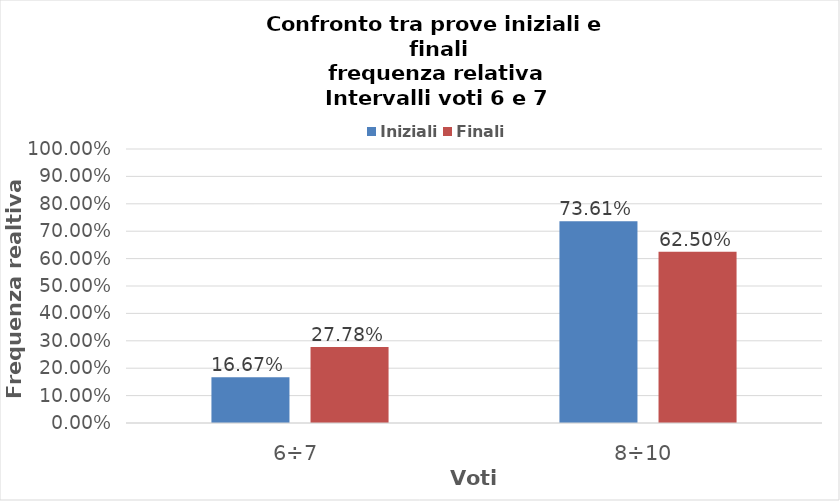
| Category | Iniziali | Finali |
|---|---|---|
| 6÷7 | 0.167 | 0.278 |
| 8÷10 | 0.736 | 0.625 |